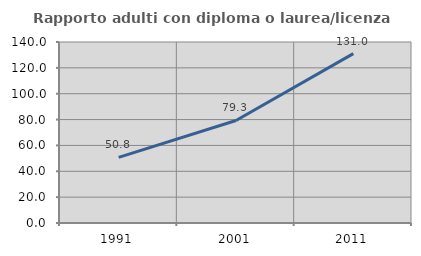
| Category | Rapporto adulti con diploma o laurea/licenza media  |
|---|---|
| 1991.0 | 50.779 |
| 2001.0 | 79.31 |
| 2011.0 | 131.048 |